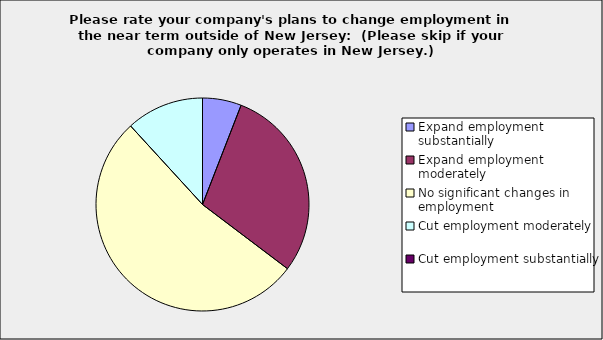
| Category | Series 0 |
|---|---|
| Expand employment substantially | 0.059 |
| Expand employment moderately | 0.294 |
| No significant changes in employment | 0.529 |
| Cut employment moderately | 0.118 |
| Cut employment substantially | 0 |